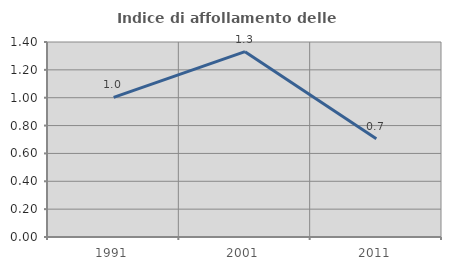
| Category | Indice di affollamento delle abitazioni  |
|---|---|
| 1991.0 | 1.003 |
| 2001.0 | 1.331 |
| 2011.0 | 0.705 |